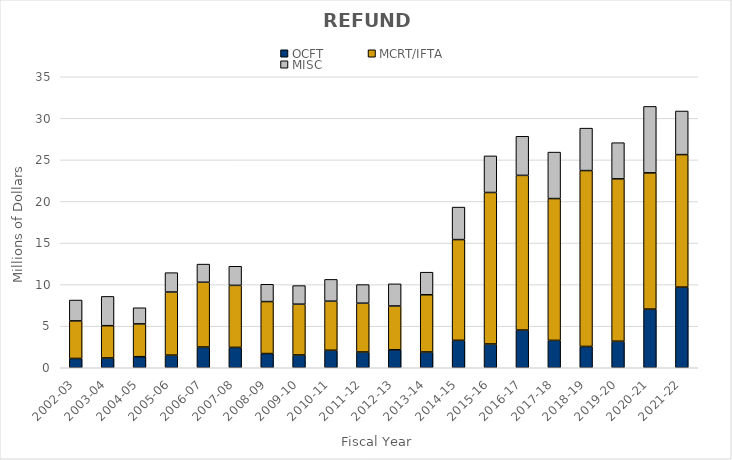
| Category | OCFT | MCRT/IFTA | MISC |
|---|---|---|---|
| 2002-03 | 1.12 | 4.517 | 2.509 |
| 2003-04 | 1.178 | 3.882 | 3.522 |
| 2004-05 | 1.329 | 3.947 | 1.939 |
| 2005-06 | 1.52 | 7.589 | 2.33 |
| 2006-07 | 2.493 | 7.792 | 2.182 |
| 2007-08 | 2.451 | 7.46 | 2.298 |
| 2008-09 | 1.709 | 6.251 | 2.082 |
| 2009-10 | 1.54 | 6.108 | 2.236 |
| 2010-11 | 2.106 | 5.904 | 2.619 |
| 2011-12 | 1.896 | 5.871 | 2.238 |
| 2012-13 | 2.16 | 5.269 | 2.663 |
| 2013-14 | 1.897 | 6.881 | 2.716 |
| 2014-15 | 3.301 | 12.113 | 3.91 |
| 2015-16 | 2.859 | 18.222 | 4.4 |
| 2016-17 | 4.532 | 18.607 | 4.701 |
| 2017-18 | 3.292 | 17.058 | 5.59 |
| 2018-19 | 2.565 | 21.15 | 5.105 |
| 2019-20 | 3.191 | 19.528 | 4.352 |
| 2020-21 | 7.052 | 16.392 | 7.991 |
| 2021-22 | 9.7 | 15.936 | 5.243 |